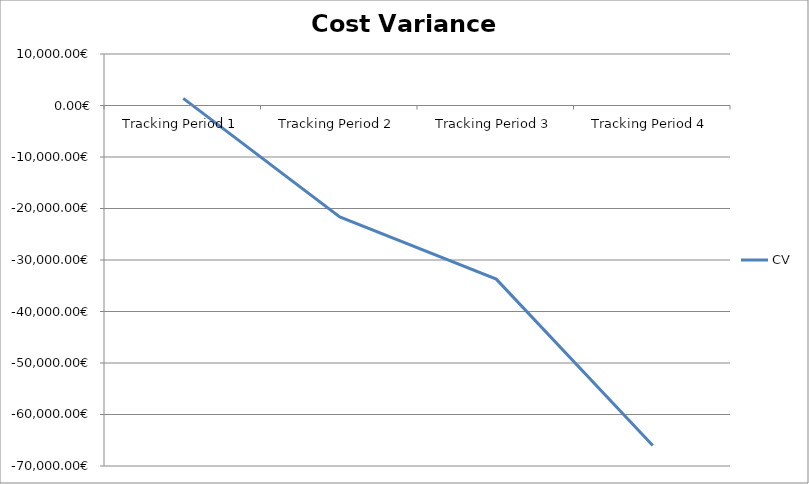
| Category | CV |
|---|---|
| Tracking Period 1 | 1376 |
| Tracking Period 2 | -21619 |
| Tracking Period 3 | -33716 |
| Tracking Period 4 | -66038 |